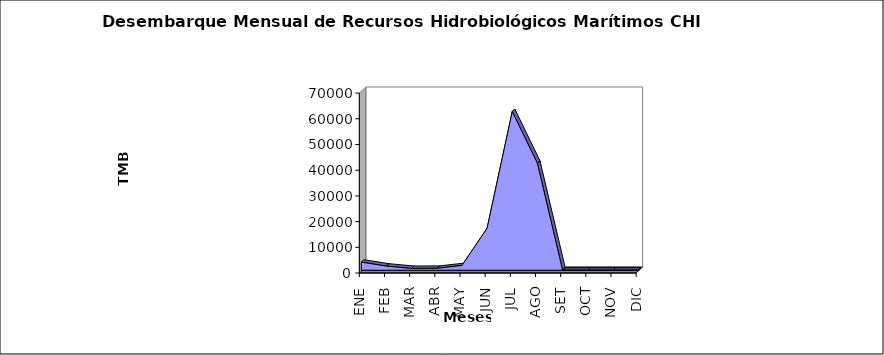
| Category | Series 12 |
|---|---|
| ENE | 3147.63 |
| FEB | 1587.89 |
| MAR | 683.65 |
| ABR | 730.47 |
| MAY | 1833.86 |
| JUN | 16362.57 |
| JUL | 61733.82 |
| AGO | 41560.31 |
| SET | 0 |
| OCT | 0 |
| NOV | 0 |
| DIC | 0 |